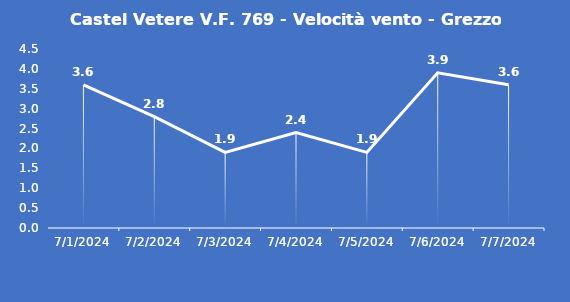
| Category | Castel Vetere V.F. 769 - Velocità vento - Grezzo (m/s) |
|---|---|
| 7/1/24 | 3.6 |
| 7/2/24 | 2.8 |
| 7/3/24 | 1.9 |
| 7/4/24 | 2.4 |
| 7/5/24 | 1.9 |
| 7/6/24 | 3.9 |
| 7/7/24 | 3.6 |